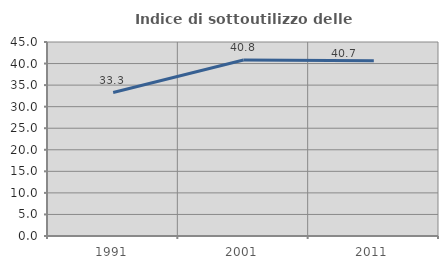
| Category | Indice di sottoutilizzo delle abitazioni  |
|---|---|
| 1991.0 | 33.268 |
| 2001.0 | 40.808 |
| 2011.0 | 40.664 |